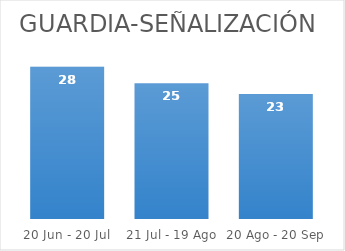
| Category | Series 0 |
|---|---|
| 20 Jun - 20 Jul | 28 |
| 21 Jul - 19 Ago | 25 |
| 20 Ago - 20 Sep | 23 |